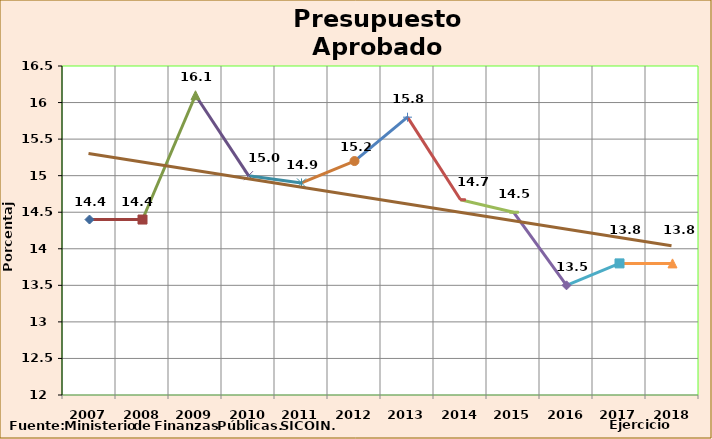
| Category | Series 0 |
|---|---|
| 2007 | 14.4 |
| 2008 | 14.4 |
| 2009 | 16.1 |
| 2010 | 15 |
| 2011 | 14.9 |
| 2012 | 15.2 |
| 2013 | 15.8 |
| 2014 | 14.67 |
| 2015 | 14.5 |
| 2016 | 13.5 |
| 2017 | 13.8 |
| 2018 | 13.8 |